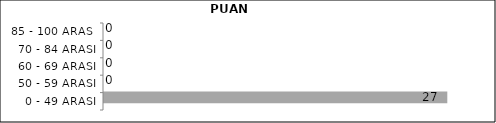
| Category | Series 0 | Series 1 | Series 2 |
|---|---|---|---|
| 0 - 49 ARASI |  |  | 27 |
| 50 - 59 ARASI |  |  | 0 |
| 60 - 69 ARASI |  |  | 0 |
| 70 - 84 ARASI |  |  | 0 |
| 85 - 100 ARASI |  |  | 0 |